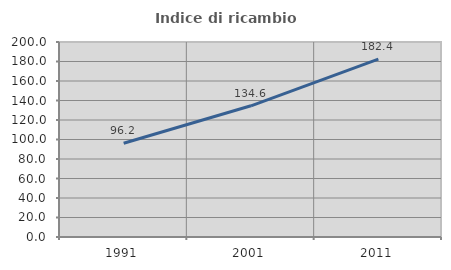
| Category | Indice di ricambio occupazionale  |
|---|---|
| 1991.0 | 96.154 |
| 2001.0 | 134.559 |
| 2011.0 | 182.424 |